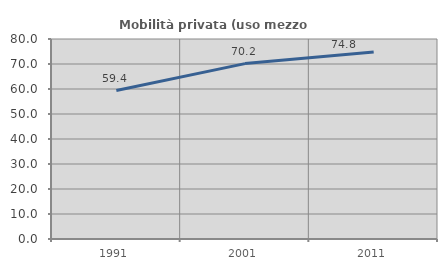
| Category | Mobilità privata (uso mezzo privato) |
|---|---|
| 1991.0 | 59.369 |
| 2001.0 | 70.162 |
| 2011.0 | 74.801 |